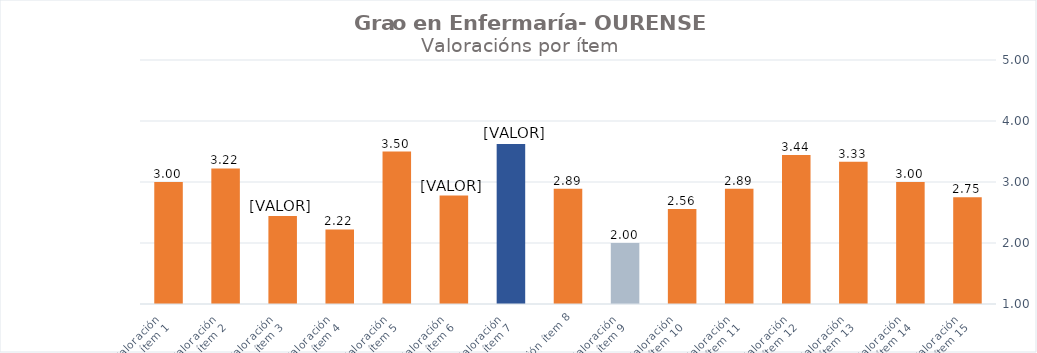
| Category | Series 0 |
|---|---|
| Valoración 
ítem 1 | 3 |
| Valoración 
ítem 2 | 3.222 |
| Valoración 
ítem 3 | 2.444 |
| Valoración 
ítem 4 | 2.222 |
| Valoración 
ítem 5 | 3.5 |
| Valoración 
ítem 6 | 2.778 |
| Valoración 
ítem 7 | 3.625 |
| Valoración ítem 8 | 2.889 |
| Valoración 
ítem 9 | 2 |
| Valoración 
ítem 10 | 2.556 |
| Valoración 
ítem 11 | 2.889 |
| Valoración 
ítem 12 | 3.444 |
| Valoración 
ítem 13 | 3.333 |
| Valoración 
ítem 14 | 3 |
| Valoración 
ítem 15 | 2.75 |